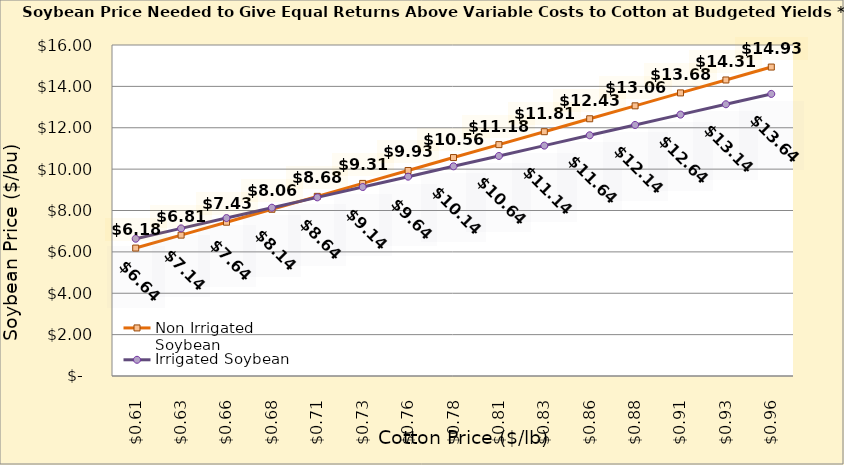
| Category | Non Irrigated Soybean | Irrigated Soybean |
|---|---|---|
| 0.6049999999999999 | 6.184 | 6.636 |
| 0.6299999999999999 | 6.809 | 7.136 |
| 0.6549999999999999 | 7.434 | 7.636 |
| 0.6799999999999999 | 8.059 | 8.136 |
| 0.705 | 8.684 | 8.636 |
| 0.73 | 9.309 | 9.136 |
| 0.755 | 9.934 | 9.636 |
| 0.78 | 10.559 | 10.136 |
| 0.805 | 11.184 | 10.636 |
| 0.8300000000000001 | 11.809 | 11.136 |
| 0.8550000000000001 | 12.434 | 11.636 |
| 0.8800000000000001 | 13.059 | 12.136 |
| 0.9050000000000001 | 13.684 | 12.636 |
| 0.9300000000000002 | 14.309 | 13.136 |
| 0.9550000000000002 | 14.934 | 13.636 |